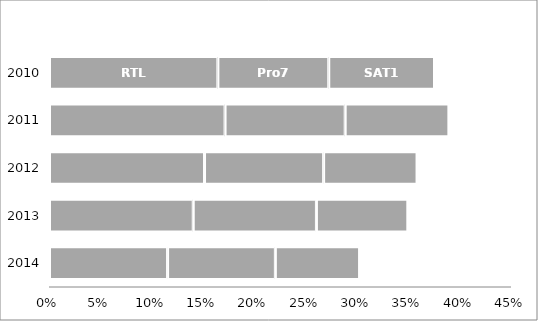
| Category | RTL | Pro7 | SAT1 |
|---|---|---|---|
| 2010-07-01 | 16.4 | 10.8 | 10.3 |
| 2011-07-01 | 17.1 | 11.7 | 10.1 |
| 2012-07-01 | 15.1 | 11.6 | 9.1 |
| 2013-07-01 | 14 | 12 | 8.9 |
| 2014-07-01 | 11.5 | 10.5 | 8.2 |